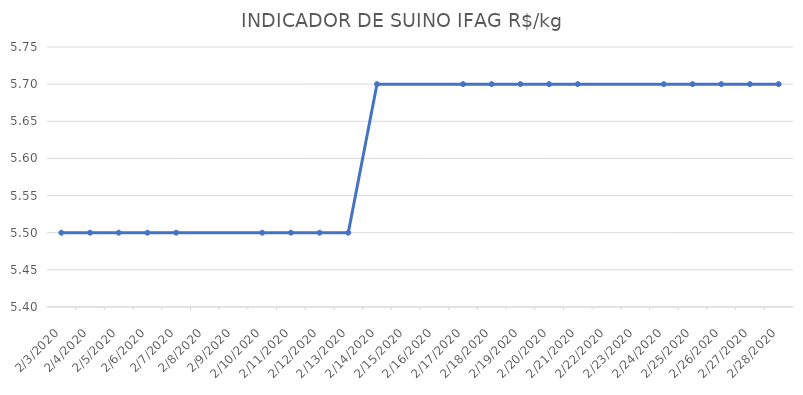
| Category | INDICADOR DE SUINO IFAG |
|---|---|
| 2/3/20 | 5.5 |
| 2/4/20 | 5.5 |
| 2/5/20 | 5.5 |
| 2/6/20 | 5.5 |
| 2/7/20 | 5.5 |
| 2/10/20 | 5.5 |
| 2/11/20 | 5.5 |
| 2/12/20 | 5.5 |
| 2/13/20 | 5.5 |
| 2/14/20 | 5.7 |
| 2/17/20 | 5.7 |
| 2/18/20 | 5.7 |
| 2/19/20 | 5.7 |
| 2/20/20 | 5.7 |
| 2/21/20 | 5.7 |
| 2/24/20 | 5.7 |
| 2/25/20 | 5.7 |
| 2/26/20 | 5.7 |
| 2/27/20 | 5.7 |
| 2/28/20 | 5.7 |